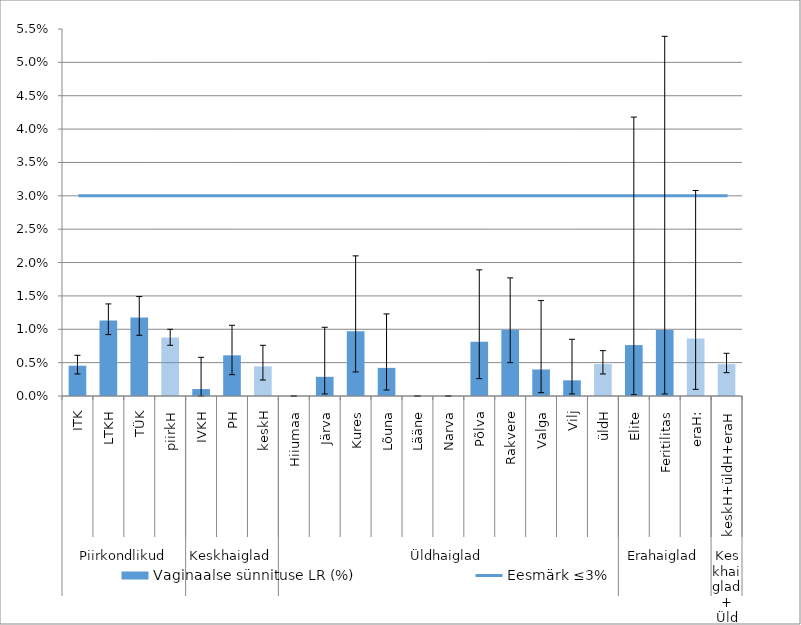
| Category | Vaginaalse sünnituse LR (%) |
|---|---|
| 0 | 0.005 |
| 1 | 0.011 |
| 2 | 0.012 |
| 3 | 0.009 |
| 4 | 0.001 |
| 5 | 0.006 |
| 6 | 0.004 |
| 7 | 0 |
| 8 | 0.003 |
| 9 | 0.01 |
| 10 | 0.004 |
| 11 | 0 |
| 12 | 0 |
| 13 | 0.008 |
| 14 | 0.01 |
| 15 | 0.004 |
| 16 | 0.002 |
| 17 | 0.005 |
| 18 | 0.008 |
| 19 | 0.01 |
| 20 | 0.009 |
| 21 | 0.005 |